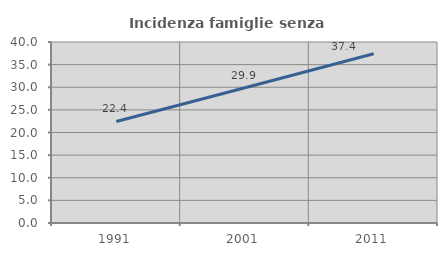
| Category | Incidenza famiglie senza nuclei |
|---|---|
| 1991.0 | 22.44 |
| 2001.0 | 29.889 |
| 2011.0 | 37.416 |